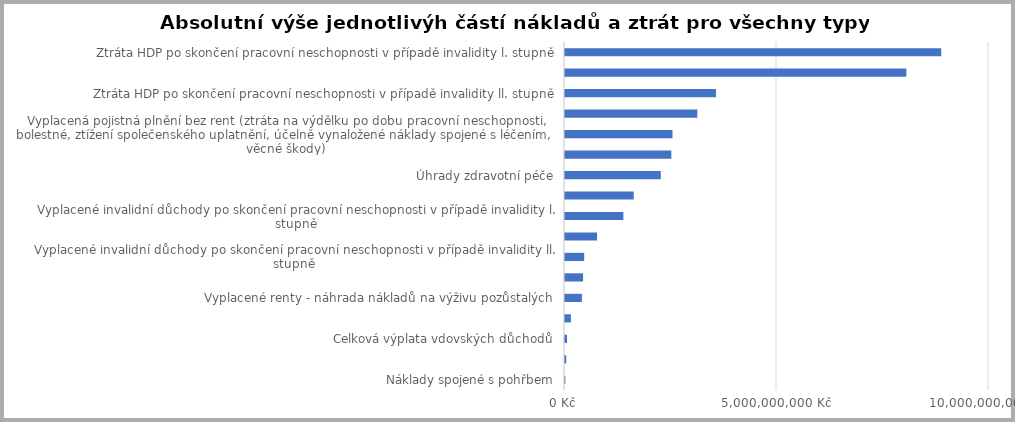
| Category | Hodnota |
|---|---|
| Náklady spojené s pohřbem | 8362000 |
| Jednorázové odškodnění pozůstalých | 29002000 |
| Celková výplata vdovských důchodů | 47401354.64 |
| Celková výplata sirotčích důchodů | 139166379.953 |
| Vyplacené renty - náhrada nákladů na výživu pozůstalých | 398180307.22 |
| Vyplacené invalidní důchody po skončení pracovní neschopnosti v případě invalidity lll. stupně | 426313510.769 |
| Vyplacené invalidní důchody po skončení pracovní neschopnosti v případě invalidity ll. stupně | 452657016.505 |
| Výplata nemocenských dávek za PÚ | 755590861.221 |
| Vyplacené invalidní důchody po skončení pracovní neschopnosti v případě invalidity l. stupně | 1376760587.676 |
| Vyplacené renty - ztráta na výdělku po ukončení pracovní neschopnosti | 1620716738.563 |
| Úhrady zdravotní péče | 2259546968.53 |
| Ztráta HDP při smrtelném PÚ | 2508044238.814 |
| Vyplacená pojistná plnění bez rent (ztráta na výdělku po dobu pracovní neschopnosti, bolestné, ztížení společenského uplatnění, účelně vynaložené náklady spojené s léčením, věcné škody) | 2535665000 |
| Ztráta HDP po skončení pracovní neschopnosti v případě invalidity lll. stupně | 3121108698.656 |
| Ztráta HDP po skončení pracovní neschopnosti v případě invalidity ll. stupně | 3560647384.519 |
| Ztráta HDP v průběhu trvání PN způsobené PÚ/NzP | 8050914747.967 |
| Ztráta HDP po skončení pracovní neschopnosti v případě invalidity l. stupně | 8873658272.5 |